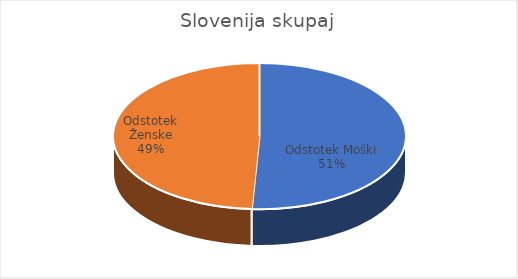
| Category | Slovenija skupaj |
|---|---|
| Odstotek Moški | 7.6 |
| Odstotek Ženske | 7.35 |